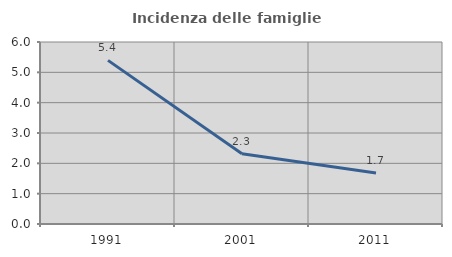
| Category | Incidenza delle famiglie numerose |
|---|---|
| 1991.0 | 5.394 |
| 2001.0 | 2.317 |
| 2011.0 | 1.681 |